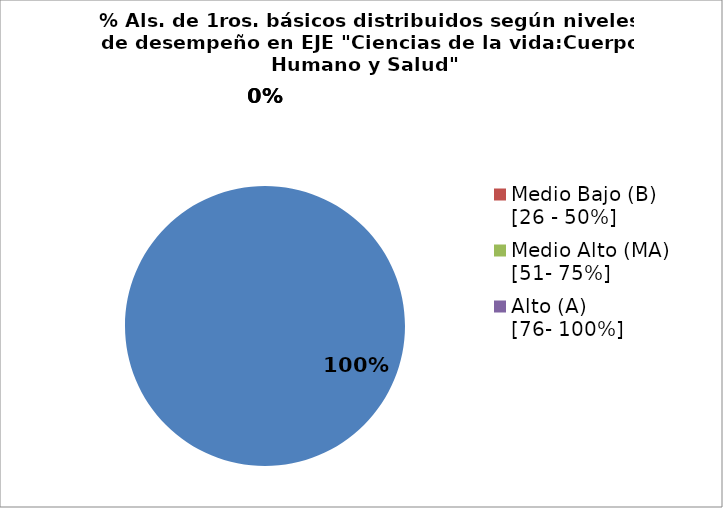
| Category | Series 0 |
|---|---|
| Bajo (B)                  [0 - 25%] | 1 |
| Medio Bajo (B)     [26 - 50%] | 0 |
| Medio Alto (MA)   [51- 75%] | 0 |
| Alto (A)               [76- 100%] | 0 |